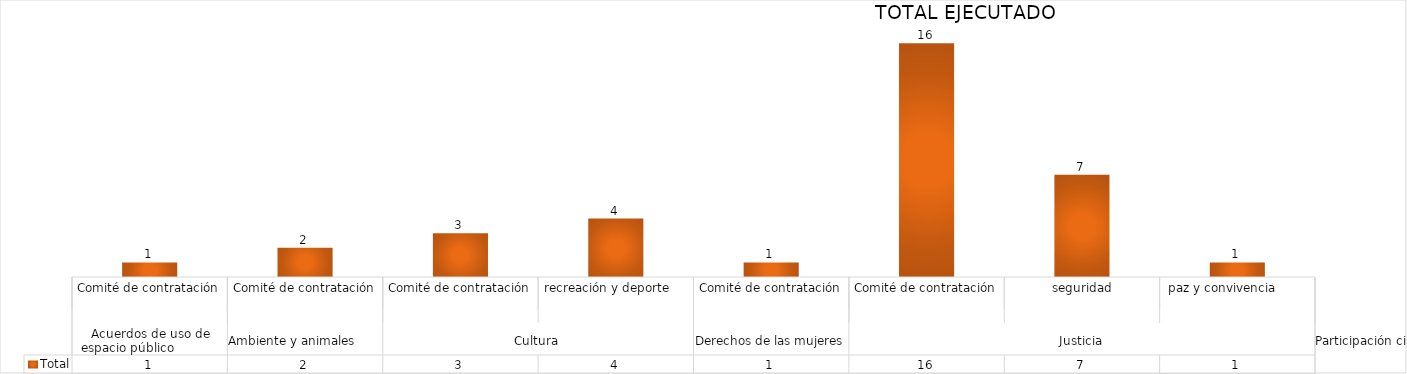
| Category | Total |
|---|---|
| 0 | 1 |
| 1 | 2 |
| 2 | 3 |
| 3 | 4 |
| 4 | 1 |
| 5 | 16 |
| 6 | 7 |
| 7 | 1 |